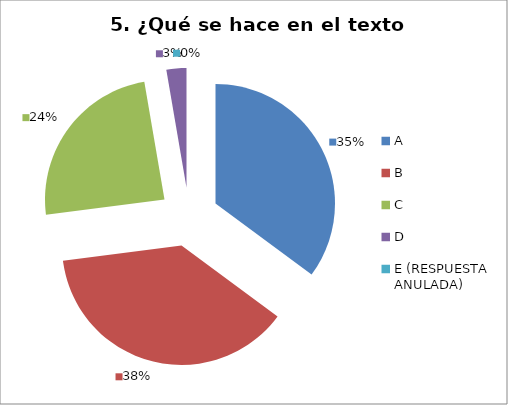
| Category | CANTIDAD DE RESPUESTAS PREGUNTA (5) | PORCENTAJE |
|---|---|---|
| A | 13 | 0.351 |
| B | 14 | 0.378 |
| C | 9 | 0.243 |
| D | 1 | 0.027 |
| E (RESPUESTA ANULADA) | 0 | 0 |